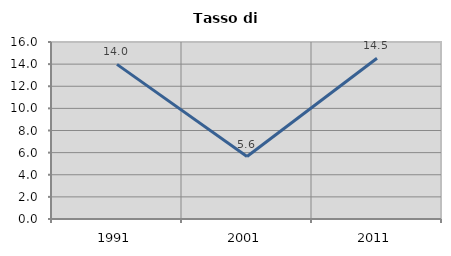
| Category | Tasso di disoccupazione   |
|---|---|
| 1991.0 | 13.978 |
| 2001.0 | 5.645 |
| 2011.0 | 14.53 |